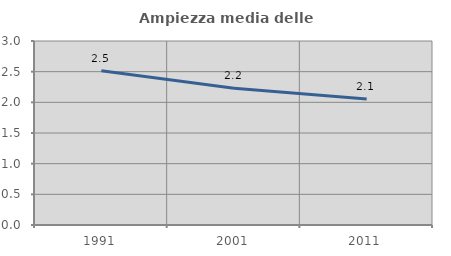
| Category | Ampiezza media delle famiglie |
|---|---|
| 1991.0 | 2.515 |
| 2001.0 | 2.229 |
| 2011.0 | 2.056 |